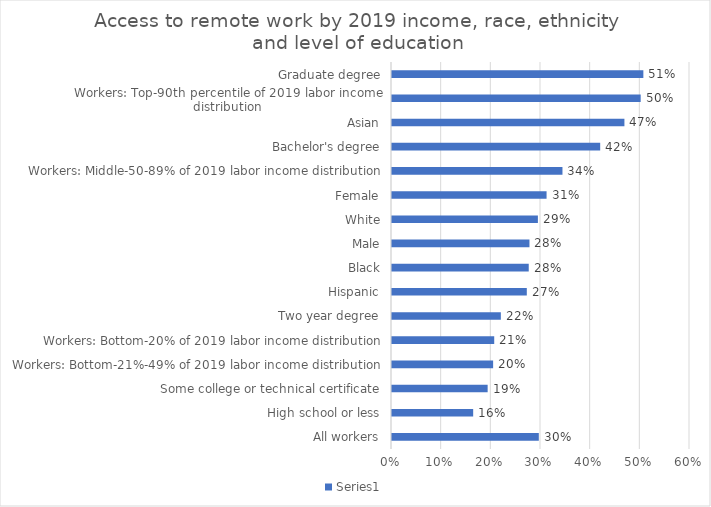
| Category | Series 0 |
|---|---|
| All workers | 0.296 |
| High school or less | 0.163 |
| Some college or technical certificate | 0.193 |
| Workers: Bottom-21%-49% of 2019 labor income distribution | 0.204 |
| Workers: Bottom-20% of 2019 labor income distribution | 0.206 |
| Two year degree | 0.219 |
| Hispanic | 0.271 |
| Black | 0.275 |
| Male | 0.277 |
| White | 0.294 |
| Female | 0.311 |
| Workers: Middle-50-89% of 2019 labor income distribution | 0.343 |
| Bachelor's degree | 0.419 |
| Asian | 0.468 |
| Workers: Top-90th percentile of 2019 labor income distribution | 0.501 |
| Graduate degree | 0.506 |